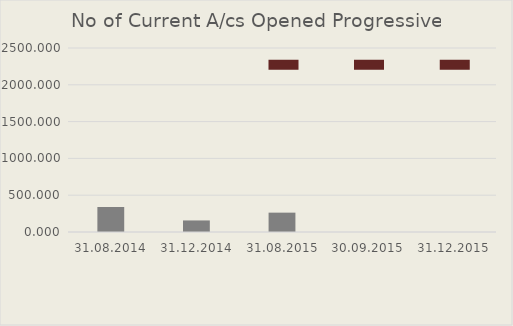
| Category | No of Current A/cs Opened Progressive |
|---|---|
| 31.08.2014 | 340 |
| 31.12.2014 | 157 |
| 31.08.2015 | 263 |
| 30.09.2015 | 0 |
| 31.12.2015 | 0 |